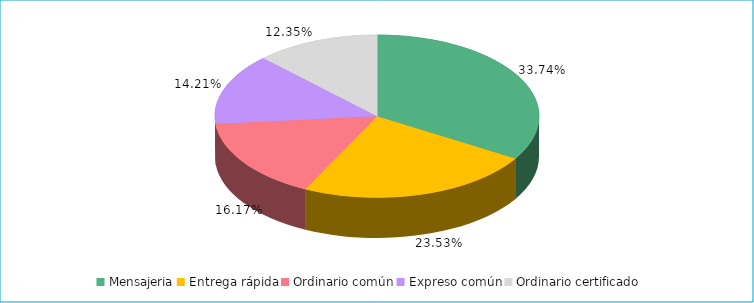
| Category | Series 0 |
|---|---|
| Mensajeria | 0.337 |
| Entrega rápida | 0.235 |
| Ordinario común | 0.162 |
| Expreso común | 0.142 |
| Ordinario certificado | 0.124 |